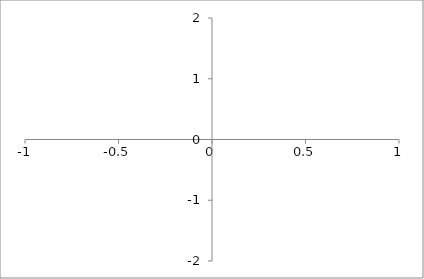
| Category | Series 0 |
|---|---|
| 0.0 | 0 |
| 0.0 | 0 |
| 0.0 | 0 |
| 0.0 | 0 |
| 0.0 | 0 |
| 0.0 | 0 |
| 0.0 | 0 |
| 0.0 | 0 |
| 0.0 | 0 |
| 0.0 | 0 |
| 0.0 | 0 |
| 0.0 | 0 |
| 0.0 | 0 |
| 0.0 | 0 |
| 0.0 | 0 |
| 0.0 | 0 |
| 0.0 | 0 |
| 0.0 | 0 |
| 0.0 | 0 |
| 0.0 | 0 |
| 0.0 | 0 |
| 0.0 | 0 |
| 0.0 | 0 |
| 0.0 | 0 |
| 0.0 | 0 |
| 0.0 | 0 |
| 0.0 | 0 |
| 0.0 | 0 |
| 0.0 | 0 |
| 0.0 | 0 |
| 0.0 | 0 |
| 0.0 | 0 |
| 0.0 | 0 |
| 0.0 | 0 |
| 0.0 | 0 |
| 0.0 | 0 |
| 0.0 | 0 |
| 0.0 | 0 |
| 0.0 | 0 |
| 0.0 | 0 |
| 0.0 | 0 |
| 0.0 | 0 |
| 0.0 | 0 |
| 0.0 | 0 |
| 0.0 | 0 |
| 0.0 | 0 |
| 0.0 | 0 |
| 0.0 | 0 |
| 0.0 | 0 |
| 0.0 | 0 |
| 0.0 | 0 |
| 0.0 | 0 |
| 0.0 | 0 |
| 0.0 | 0 |
| 0.0 | 0 |
| 0.0 | 0 |
| 0.0 | 0 |
| 0.0 | 0 |
| 0.0 | 0 |
| 0.0 | 0 |
| 0.0 | 0 |
| 0.0 | 0 |
| 0.0 | 0 |
| 0.0 | 0 |
| 0.0 | 0 |
| 0.0 | 0 |
| 0.0 | 0 |
| 0.0 | 0 |
| 0.0 | 0 |
| 0.0 | 0 |
| 0.0 | 0 |
| 0.0 | 0 |
| 0.0 | 0 |
| 0.0 | 0 |
| 0.0 | 0 |
| 0.0 | 0 |
| 0.0 | 0 |
| 0.0 | 0 |
| 0.0 | 0 |
| 0.0 | 0 |
| 0.0 | 0 |
| 0.0 | 0 |
| 0.0 | 0 |
| 0.0 | 0 |
| 0.0 | 0 |
| 0.0 | 0 |
| 0.0 | 0 |
| 0.0 | 0 |
| 0.0 | 0 |
| 0.0 | 0 |
| 0.0 | 0 |
| 0.0 | 0 |
| 0.0 | 0 |
| 0.0 | 0 |
| 0.0 | 0 |
| 0.0 | 0 |
| 0.0 | 0 |
| 0.0 | 0 |
| 0.0 | 0 |